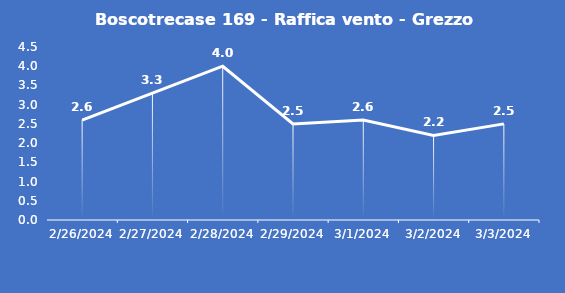
| Category | Boscotrecase 169 - Raffica vento - Grezzo (m/s) |
|---|---|
| 2/26/24 | 2.6 |
| 2/27/24 | 3.3 |
| 2/28/24 | 4 |
| 2/29/24 | 2.5 |
| 3/1/24 | 2.6 |
| 3/2/24 | 2.2 |
| 3/3/24 | 2.5 |